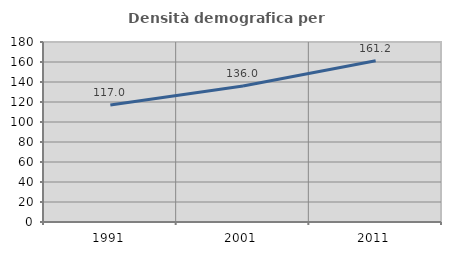
| Category | Densità demografica |
|---|---|
| 1991.0 | 117.029 |
| 2001.0 | 135.971 |
| 2011.0 | 161.197 |